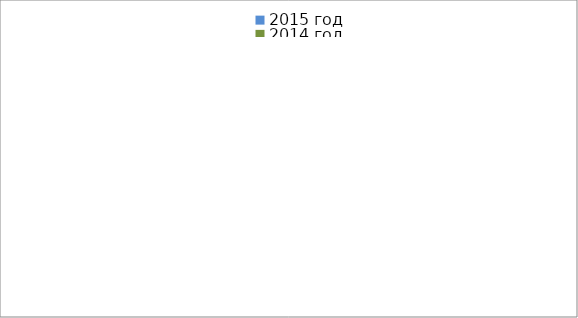
| Category | 2015 год | 2014 год |
|---|---|---|
|  - поджог | 0 | 0 |
|  - неосторожное обращение с огнём | 6 | 4 |
|  - НПТЭ электрооборудования | 1 | 0 |
|  - НПУ и Э печей | 7 | 5 |
|  - НПУ и Э транспортных средств | 2 | 8 |
|   -Шалость с огнем детей | 0 | 0 |
|  -НППБ при эксплуатации эл.приборов | 5 | 2 |
|  - курение | 0 | 1 |
| - прочие | 1 | 7 |
| - не установленные причины | 0 | 0 |